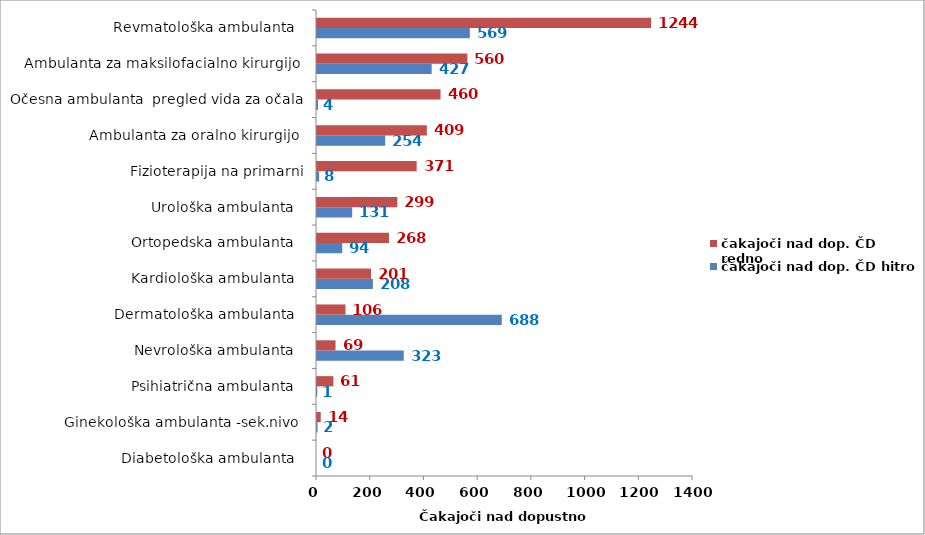
| Category | čakajoči nad dop. ČD hitro | čakajoči nad dop. ČD redno |
|---|---|---|
| Diabetološka ambulanta   | 0 | 0 |
| Ginekološka ambulanta -sek.nivo  | 2 | 14 |
| Psihiatrična ambulanta   | 1 | 61 |
| Nevrološka ambulanta   | 323 | 69 |
| Dermatološka ambulanta   | 688 | 106 |
| Kardiološka ambulanta   | 208 | 201 |
| Ortopedska ambulanta   | 94 | 268 |
| Urološka ambulanta   | 131 | 299 |
| Fizioterapija na primarni | 8 | 371 |
| Ambulanta za oralno kirurgijo  | 254 | 409 |
| Očesna ambulanta  pregled vida za očala | 4 | 460 |
| Ambulanta za maksilofacialno kirurgijo  | 427 | 560 |
| Revmatološka ambulanta   | 569 | 1244 |